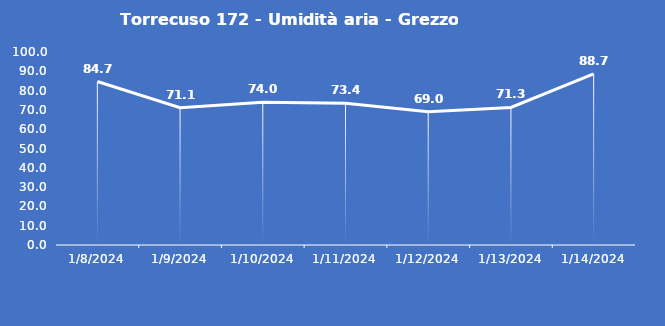
| Category | Torrecuso 172 - Umidità aria - Grezzo (%) |
|---|---|
| 1/8/24 | 84.7 |
| 1/9/24 | 71.1 |
| 1/10/24 | 74 |
| 1/11/24 | 73.4 |
| 1/12/24 | 69 |
| 1/13/24 | 71.3 |
| 1/14/24 | 88.7 |